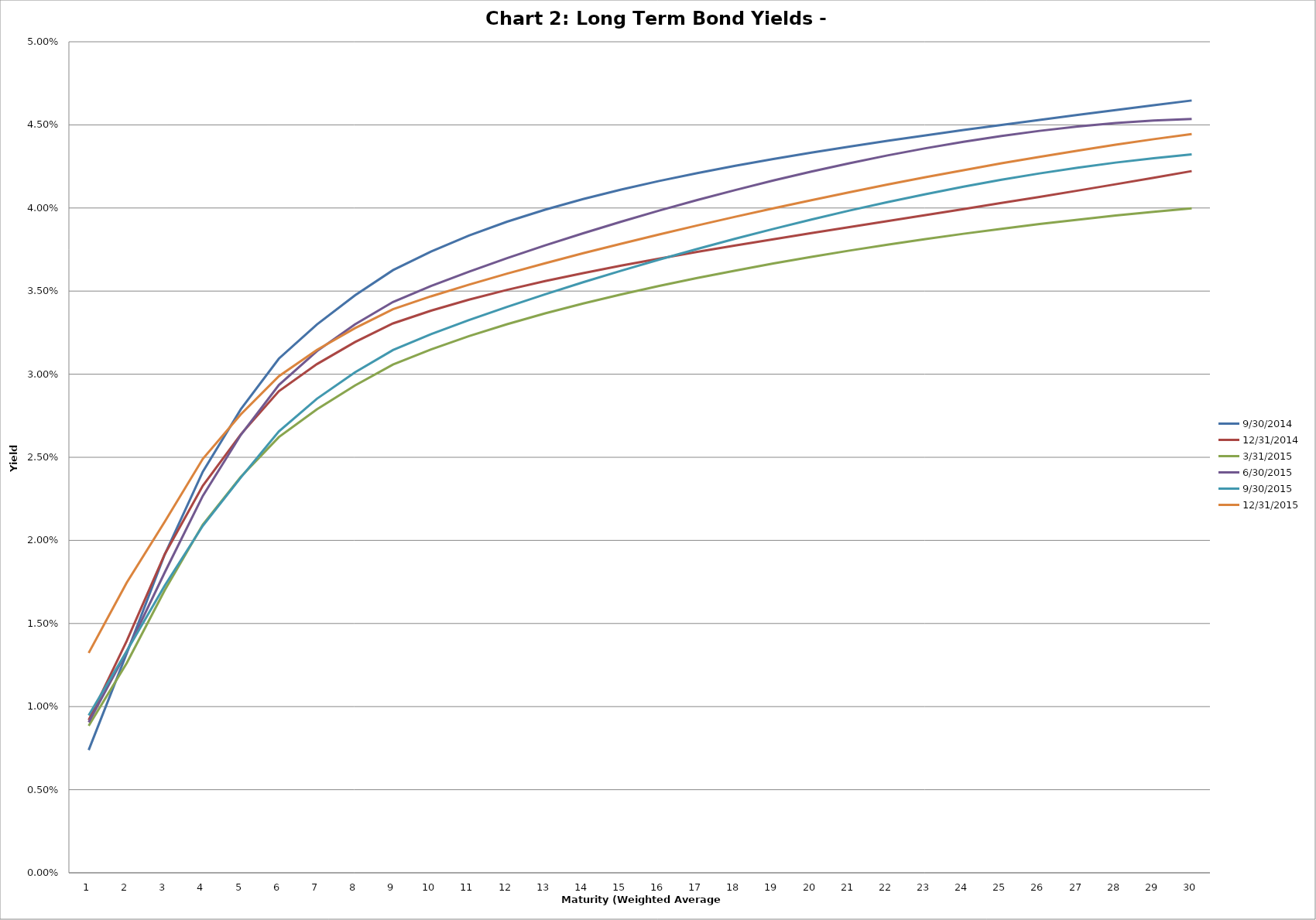
| Category | 9/30/2014 | 12/31/2014 | 3/31/2015 | 6/30/2015 | 9/30/2015 | 12/31/2015 |
|---|---|---|---|---|---|---|
| 0 | 0.007 | 0.009 | 0.009 | 0.009 | 0.009 | 0.013 |
| 1 | 0.013 | 0.014 | 0.013 | 0.013 | 0.013 | 0.017 |
| 2 | 0.019 | 0.019 | 0.017 | 0.018 | 0.017 | 0.021 |
| 3 | 0.024 | 0.023 | 0.021 | 0.023 | 0.021 | 0.025 |
| 4 | 0.028 | 0.026 | 0.024 | 0.026 | 0.024 | 0.028 |
| 5 | 0.031 | 0.029 | 0.026 | 0.029 | 0.027 | 0.03 |
| 6 | 0.033 | 0.031 | 0.028 | 0.031 | 0.029 | 0.031 |
| 7 | 0.035 | 0.032 | 0.029 | 0.033 | 0.03 | 0.033 |
| 8 | 0.036 | 0.033 | 0.031 | 0.034 | 0.031 | 0.034 |
| 9 | 0.037 | 0.034 | 0.031 | 0.035 | 0.032 | 0.035 |
| 10 | 0.038 | 0.034 | 0.032 | 0.036 | 0.033 | 0.035 |
| 11 | 0.039 | 0.035 | 0.033 | 0.037 | 0.034 | 0.036 |
| 12 | 0.04 | 0.036 | 0.034 | 0.038 | 0.035 | 0.037 |
| 13 | 0.041 | 0.036 | 0.034 | 0.038 | 0.036 | 0.037 |
| 14 | 0.041 | 0.037 | 0.035 | 0.039 | 0.036 | 0.038 |
| 15 | 0.042 | 0.037 | 0.035 | 0.04 | 0.037 | 0.038 |
| 16 | 0.042 | 0.037 | 0.036 | 0.04 | 0.038 | 0.039 |
| 17 | 0.043 | 0.038 | 0.036 | 0.041 | 0.038 | 0.039 |
| 18 | 0.043 | 0.038 | 0.037 | 0.042 | 0.039 | 0.04 |
| 19 | 0.043 | 0.038 | 0.037 | 0.042 | 0.039 | 0.04 |
| 20 | 0.044 | 0.039 | 0.037 | 0.043 | 0.04 | 0.041 |
| 21 | 0.044 | 0.039 | 0.038 | 0.043 | 0.04 | 0.041 |
| 22 | 0.044 | 0.04 | 0.038 | 0.044 | 0.041 | 0.042 |
| 23 | 0.045 | 0.04 | 0.038 | 0.044 | 0.041 | 0.042 |
| 24 | 0.045 | 0.04 | 0.039 | 0.044 | 0.042 | 0.043 |
| 25 | 0.045 | 0.041 | 0.039 | 0.045 | 0.042 | 0.043 |
| 26 | 0.046 | 0.041 | 0.039 | 0.045 | 0.042 | 0.043 |
| 27 | 0.046 | 0.041 | 0.04 | 0.045 | 0.043 | 0.044 |
| 28 | 0.046 | 0.042 | 0.04 | 0.045 | 0.043 | 0.044 |
| 29 | 0.046 | 0.042 | 0.04 | 0.045 | 0.043 | 0.044 |